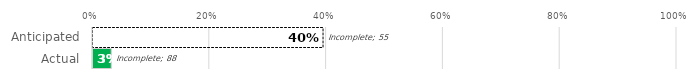
| Category | Complete | Incomplete |
|---|---|---|
| Anticipated | 36 | 55 |
| Actual | 3 | 88 |